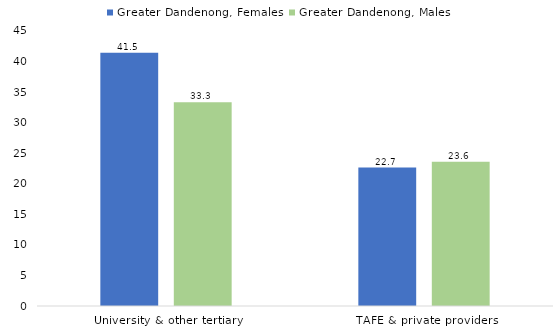
| Category | Greater Dandenong, Females | Greater Dandenong, Males |
|---|---|---|
| University & other tertiary | 41.451 | 33.322 |
| TAFE & private providers | 22.653 | 23.608 |